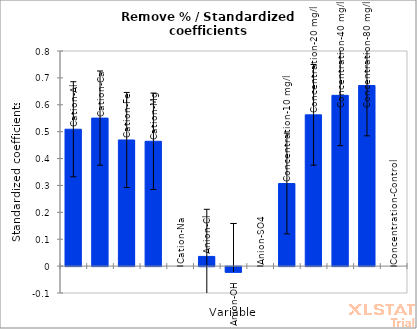
| Category | Series 0 |
|---|---|
| Cation-Al | 0.509 |
| Cation-Ca | 0.55 |
| Cation-Fe | 0.469 |
| Cation-Mg | 0.464 |
| Cation-Na | 0 |
| Anion-Cl | 0.036 |
| Anion-OH | -0.021 |
| Anion-SO4 | 0 |
| Concentration-10 mg/l | 0.307 |
| Concentration-20 mg/l | 0.563 |
| Concentration-40 mg/l | 0.635 |
| Concentration-80 mg/l | 0.672 |
| Concentration-Control | 0 |